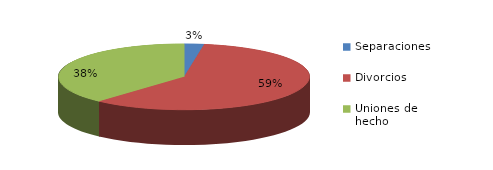
| Category | Series 0 |
|---|---|
| Separaciones | 49 |
| Divorcios | 1146 |
| Uniones de hecho | 740 |